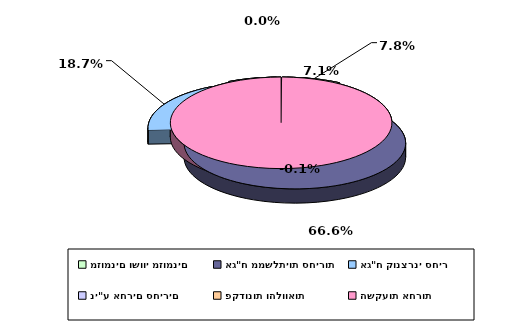
| Category | Series 0 |
|---|---|
| מזומנים ושווי מזומנים | 0.078 |
| אג"ח ממשלתיות סחירות | 0.666 |
| אג"ח קונצרני סחיר | 0.187 |
| ני"ע אחרים סחירים | 0.071 |
| פקדונות והלוואות | 0 |
| השקעות אחרות | -0.001 |